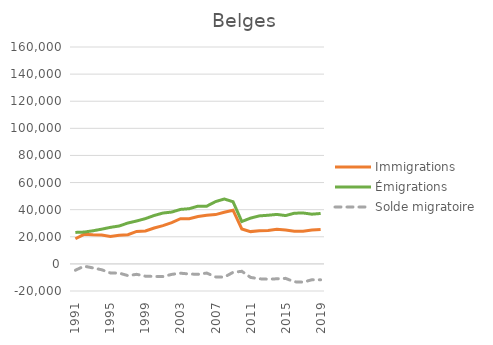
| Category | Immigrations | Émigrations | Solde migratoire |
|---|---|---|---|
| 1991 | 18540 | 23212 | -4672 |
| 1992 | 21793 | 23468 | -1675 |
| 1993 | 21453 | 24417 | -2964 |
| 1994 | 21294 | 25606 | -4312 |
| 1995 | 20255 | 26949 | -6694 |
| 1996 | 21153 | 27960 | -6807 |
| 1997 | 21516 | 30163 | -8647 |
| 1998 | 23960 | 31657 | -7697 |
| 1999 | 24321 | 33406 | -9085 |
| 2000 | 26451 | 35715 | -9264 |
| 2001 | 28183 | 37518 | -9335 |
| 2002 | 30492 | 38233 | -7741 |
| 2003 | 33315 | 40188 | -6873 |
| 2004 | 33278 | 40722 | -7444 |
| 2005 | 34923 | 42604 | -7681 |
| 2006 | 35827 | 42595 | -6768 |
| 2007 | 36363 | 45943 | -9580 |
| 2008 | 38083 | 47868 | -9785 |
| 2009 | 39602 | 45845 | -6243 |
| 2010 | 25804 | 31261 | -5457 |
| 2011 | 23810 | 33773 | -9963 |
| 2012 | 24403 | 35409 | -11006 |
| 2013 | 24617 | 35880 | -11263 |
| 2014 | 25483 | 36497 | -11014 |
| 2015 | 24963 | 35640 | -10677 |
| 2016 | 24157 | 37389 | -13232 |
| 2017 | 24100 | 37557 | -13457 |
| 2018 | 24943 | 36661 | -11718 |
| 2019 | 25417 | 37186 | -11769 |